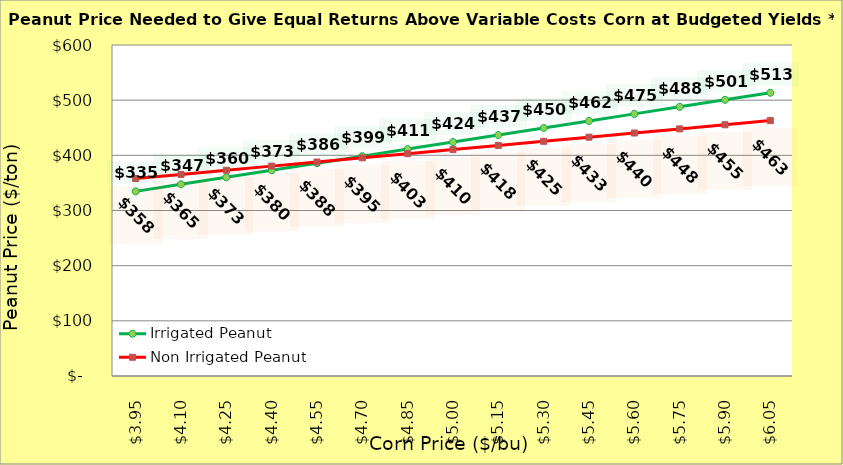
| Category | Irrigated Peanut | Non Irrigated Peanut |
|---|---|---|
| 3.949999999999998 | 334.699 | 357.943 |
| 4.099999999999998 | 347.465 | 365.443 |
| 4.249999999999998 | 360.231 | 372.943 |
| 4.399999999999999 | 372.997 | 380.443 |
| 4.549999999999999 | 385.763 | 387.943 |
| 4.699999999999999 | 398.529 | 395.443 |
| 4.85 | 411.295 | 402.943 |
| 5.0 | 424.061 | 410.443 |
| 5.15 | 436.827 | 417.943 |
| 5.300000000000001 | 449.593 | 425.443 |
| 5.450000000000001 | 462.359 | 432.943 |
| 5.600000000000001 | 475.125 | 440.443 |
| 5.750000000000002 | 487.891 | 447.943 |
| 5.900000000000002 | 500.657 | 455.443 |
| 6.0500000000000025 | 513.423 | 462.943 |